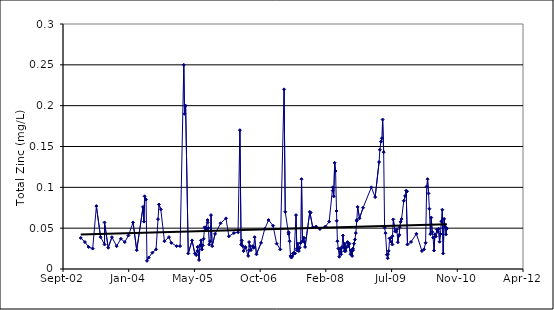
| Category | Series 0 |
|---|---|
| 37635.0 | 0.038 |
| 37667.0 | 0.033 |
| 37695.0 | 0.027 |
| 37726.0 | 0.025 |
| 37754.0 | 0.077 |
| 37786.0 | 0.039 |
| 37816.0 | 0.03 |
| 37816.0 | 0.057 |
| 37844.0 | 0.026 |
| 37872.0 | 0.039 |
| 37908.0 | 0.028 |
| 37940.0 | 0.037 |
| 37970.0 | 0.033 |
| 37998.0 | 0.041 |
| 38033.0 | 0.057 |
| 38061.0 | 0.023 |
| 38109.0 | 0.076 |
| 38116.0 | 0.058 |
| 38121.0 | 0.089 |
| 38132.0 | 0.085 |
| 38139.0 | 0.01 |
| 38152.0 | 0.014 |
| 38180.0 | 0.02 |
| 38208.0 | 0.024 |
| 38223.0 | 0.061 |
| 38230.0 | 0.079 |
| 38244.0 | 0.073 |
| 38272.0 | 0.034 |
| 38306.0 | 0.039 |
| 38324.0 | 0.032 |
| 38364.0 | 0.028 |
| 38391.0 | 0.028 |
| 38419.0 | 0.25 |
| 38425.0 | 0.19 |
| 38433.0 | 0.2 |
| 38453.0 | 0.019 |
| 38482.0 | 0.035 |
| 38503.0 | 0.019 |
| 38514.0 | 0.017 |
| 38522.0 | 0.022 |
| 38524.0 | 0.027 |
| 38535.0 | 0.011 |
| 38543.0 | 0.029 |
| 38550.0 | 0.035 |
| 38558.0 | 0.024 |
| 38564.0 | 0.029 |
| 38570.0 | 0.037 |
| 38577.0 | 0.051 |
| 38584.0 | 0.051 |
| 38587.0 | 0.05 |
| 38591.0 | 0.049 |
| 38600.0 | 0.06 |
| 38601.0 | 0.057 |
| 38606.0 | 0.05 |
| 38613.0 | 0.03 |
| 38619.0 | 0.034 |
| 38626.0 | 0.066 |
| 38635.0 | 0.028 |
| 38657.0 | 0.043 |
| 38699.0 | 0.056 |
| 38740.0 | 0.062 |
| 38762.0 | 0.04 |
| 38800.0 | 0.044 |
| 38832.0 | 0.045 |
| 38846.0 | 0.17 |
| 38855.0 | 0.03 |
| 38860.0 | 0.035 |
| 38867.0 | 0.028 |
| 38874.0 | 0.022 |
| 38887.0 | 0.027 |
| 38888.0 | 0.026 |
| 38909.0 | 0.016 |
| 38915.0 | 0.023 |
| 38916.0 | 0.033 |
| 38923.0 | 0.028 |
| 38930.0 | 0.023 |
| 38944.0 | 0.028 |
| 38950.0 | 0.026 |
| 38951.0 | 0.027 |
| 38958.0 | 0.039 |
| 38972.0 | 0.018 |
| 39007.0 | 0.032 |
| 39035.0 | 0.049 |
| 39064.0 | 0.06 |
| 39098.0 | 0.053 |
| 39126.0 | 0.031 |
| 39153.0 | 0.024 |
| 39182.0 | 0.22 |
| 39191.0 | 0.07 |
| 39216.0 | 0.043 |
| 39217.0 | 0.045 |
| 39224.0 | 0.034 |
| 39231.0 | 0.016 |
| 39238.0 | 0.014 |
| 39245.0 | 0.016 |
| 39251.0 | 0.019 |
| 39252.0 | 0.019 |
| 39259.0 | 0.02 |
| 39266.0 | 0.019 |
| 39273.0 | 0.066 |
| 39279.0 | 0.025 |
| 39280.0 | 0.023 |
| 39287.0 | 0.031 |
| 39294.0 | 0.022 |
| 39301.0 | 0.026 |
| 39308.0 | 0.032 |
| 39315.0 | 0.11 |
| 39322.0 | 0.034 |
| 39329.0 | 0.038 |
| 39335.0 | 0.038 |
| 39336.0 | 0.033 |
| 39342.0 | 0.027 |
| 39378.0 | 0.07 |
| 39384.0 | 0.069 |
| 39400.0 | 0.051 |
| 39426.0 | 0.052 |
| 39455.0 | 0.049 |
| 39497.0 | 0.052 |
| 39525.0 | 0.058 |
| 39552.0 | 0.1 |
| 39553.0 | 0.096 |
| 39560.0 | 0.089 |
| 39567.0 | 0.13 |
| 39574.0 | 0.12 |
| 39581.0 | 0.071 |
| 39583.0 | 0.059 |
| 39588.0 | 0.034 |
| 39595.0 | 0.025 |
| 39602.0 | 0.015 |
| 39609.0 | 0.025 |
| 39615.0 | 0.021 |
| 39616.0 | 0.018 |
| 39623.0 | 0.027 |
| 39630.0 | 0.041 |
| 39637.0 | 0.026 |
| 39643.0 | 0.022 |
| 39645.0 | 0.031 |
| 39651.0 | 0.022 |
| 39660.0 | 0.027 |
| 39665.0 | 0.033 |
| 39671.0 | 0.028 |
| 39672.0 | 0.032 |
| 39679.0 | 0.031 |
| 39688.0 | 0.018 |
| 39693.0 | 0.023 |
| 39700.0 | 0.016 |
| 39706.0 | 0.025 |
| 39707.0 | 0.023 |
| 39714.0 | 0.031 |
| 39721.0 | 0.036 |
| 39728.0 | 0.044 |
| 39735.0 | 0.059 |
| 39736.0 | 0.06 |
| 39742.0 | 0.076 |
| 39756.0 | 0.062 |
| 39783.0 | 0.075 |
| 39846.0 | 0.1 |
| 39875.0 | 0.088 |
| 39905.0 | 0.131 |
| 39911.0 | 0.146 |
| 39919.0 | 0.156 |
| 39926.0 | 0.16 |
| 39932.0 | 0.183 |
| 39940.0 | 0.143 |
| 39947.0 | 0.051 |
| 39954.0 | 0.044 |
| 39964.0 | 0.018 |
| 39971.0 | 0.013 |
| 39972.0 | 0.018 |
| 39978.0 | 0.022 |
| 39985.0 | 0.038 |
| 39992.0 | 0.038 |
| 39999.0 | 0.033 |
| 40006.0 | 0.03 |
| 40007.0 | 0.04 |
| 40013.0 | 0.061 |
| 40027.0 | 0.046 |
| 40034.0 | 0.046 |
| 40040.0 | 0.048 |
| 40048.0 | 0.033 |
| 40055.0 | 0.041 |
| 40059.0 | 0.042 |
| 40062.0 | 0.051 |
| 40069.0 | 0.058 |
| 40076.0 | 0.061 |
| 40093.0 | 0.084 |
| 40103.0 | 0.09 |
| 40111.0 | 0.096 |
| 40118.0 | 0.095 |
| 40121.0 | 0.03 |
| 40148.0 | 0.033 |
| 40189.0 | 0.043 |
| 40231.0 | 0.022 |
| 40247.0 | 0.024 |
| 40259.0 | 0.032 |
| 40267.0 | 0.101 |
| 40274.0 | 0.11 |
| 40281.0 | 0.092 |
| 40288.0 | 0.074 |
| 40295.0 | 0.043 |
| 40302.0 | 0.063 |
| 40309.0 | 0.045 |
| 40316.0 | 0.038 |
| 40323.0 | 0.023 |
| 40330.0 | 0.043 |
| 40337.0 | 0.04 |
| 40344.0 | 0.048 |
| 40351.0 | 0.046 |
| 40358.0 | 0.049 |
| 40365.0 | 0.033 |
| 40372.0 | 0.043 |
| 40379.0 | 0.058 |
| 40386.0 | 0.073 |
| 40393.0 | 0.019 |
| 40400.0 | 0.061 |
| 40407.0 | 0.052 |
| 40414.0 | 0.042 |
| 40421.0 | 0.05 |